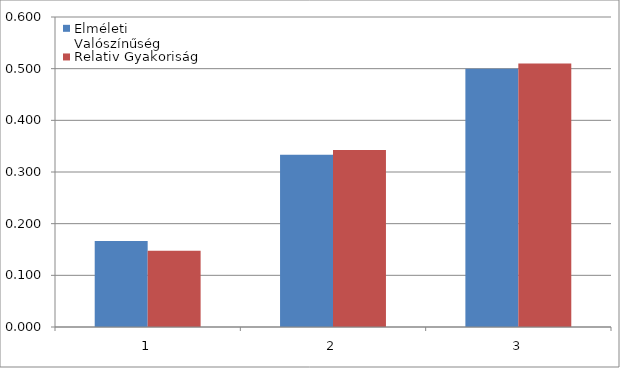
| Category | Elméleti Valószínűség | Relativ Gyakoriság |
|---|---|---|
| 0 | 0.167 | 0.148 |
| 1 | 0.333 | 0.342 |
| 2 | 0.5 | 0.51 |